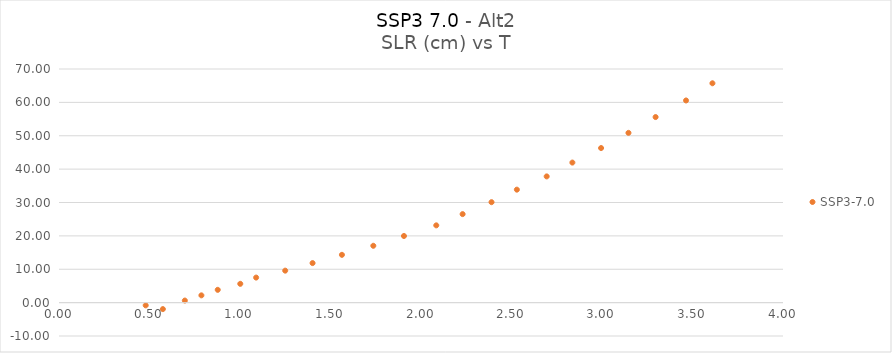
| Category | SSP3-7.0 |
|---|---|
| 0.573801925 | -1.941 |
| 0.479031654 | -0.818 |
| 0.695197934 | 0.621 |
| 0.786748548 | 2.18 |
| 0.877021499 | 3.834 |
| 1.001520332 | 5.633 |
| 1.089128948 | 7.505 |
| 1.249789297 | 9.582 |
| 1.40090264 | 11.846 |
| 1.563168575 | 14.321 |
| 1.736541854 | 17.03 |
| 1.905828217 | 19.967 |
| 2.084382989 | 23.152 |
| 2.229923662 | 26.519 |
| 2.38966606 | 30.098 |
| 2.529669917 | 33.847 |
| 2.694372326 | 37.818 |
| 2.836326075 | 41.963 |
| 2.994932826 | 46.317 |
| 3.14626165 | 50.865 |
| 3.296151687 | 55.603 |
| 3.46433806 | 60.572 |
| 3.610117907 | 65.723 |